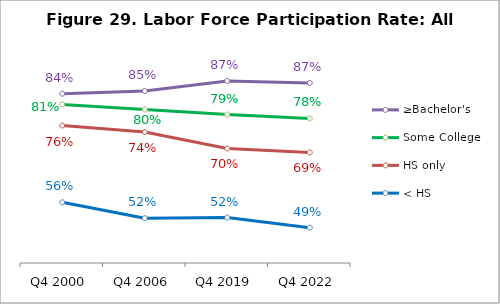
| Category | ≥Bachelor's | Some College | HS only | < HS |
|---|---|---|---|---|
| Q4 2000 | 0.842 | 0.814 | 0.759 | 0.558 |
| Q4 2006 | 0.849 | 0.8 | 0.742 | 0.517 |
| Q4 2019 | 0.875 | 0.787 | 0.699 | 0.519 |
| Q4 2022 | 0.87 | 0.777 | 0.688 | 0.492 |